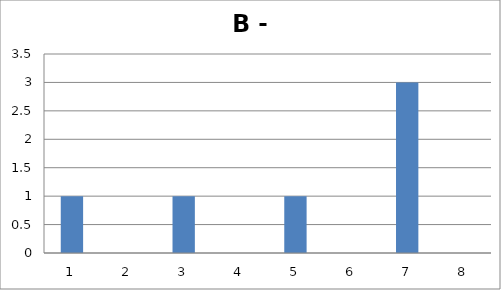
| Category | B - Input |
|---|---|
| 0 | 1 |
| 1 | 0 |
| 2 | 1 |
| 3 | 0 |
| 4 | 1 |
| 5 | 0 |
| 6 | 3 |
| 7 | 0 |